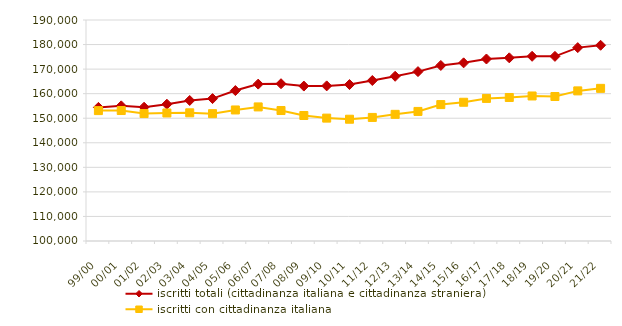
| Category | iscritti totali (cittadinanza italiana e cittadinanza straniera) | iscritti con cittadinanza italiana |
|---|---|---|
| 99/00 | 154413 | 153105 |
| 00/01 | 155040 | 153136 |
| 01/02 | 154484 | 151897 |
| 02/03 | 155707 | 152137 |
| 03/04 | 157225 | 152205 |
| 04/05 | 157996 | 151859 |
| 05/06 | 161264 | 153364 |
| 06/07 | 163890 | 154604 |
| 07/08 | 164047 | 153136 |
| 08/09 | 163092 | 151112 |
| 09/10 | 163172 | 150043 |
| 10/11 | 163712 | 149588 |
| 11/12 | 165361 | 150324 |
| 12/13 | 167084 | 151583 |
| 13/14 | 168982 | 152769 |
| 14/15 | 171491 | 155555 |
| 15/16 | 172551 | 156501 |
| 16/17 | 174119 | 158068 |
| 17/18 | 174599 | 158451 |
| 18/19 | 175223 | 159062 |
| 19/20 | 175187 | 158842 |
| 20/21 | 178753 | 161133 |
| 21/22 | 179707 | 162167 |